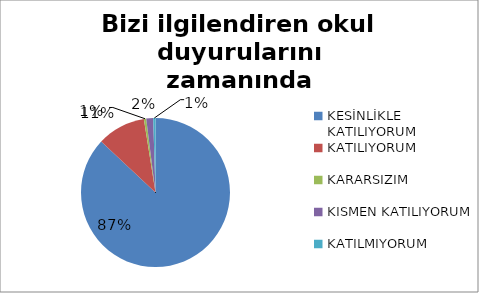
| Category | Bizi ilgilendiren okul duyurularını zamanında öğreniyorum. |
|---|---|
| KESİNLİKLE KATILIYORUM | 174 |
| KATILIYORUM | 21 |
| KARARSIZIM | 1 |
| KISMEN KATILIYORUM | 3 |
| KATILMIYORUM | 1 |